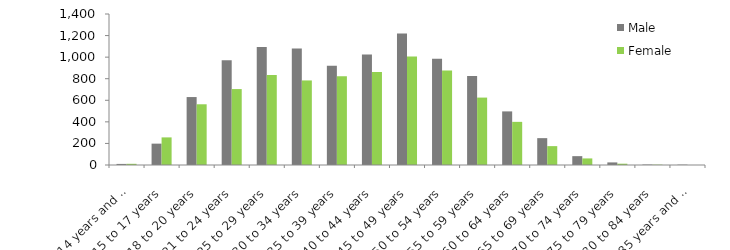
| Category | Male | Female |
|---|---|---|
| 14 years and under | 10 | 11 |
| 15 to 17 years | 198 | 256 |
| 18 to 20 years | 630 | 563 |
| 21 to 24 years | 972 | 704 |
| 25 to 29 years | 1095 | 835 |
| 30 to 34 years | 1081 | 784 |
| 35 to 39 years | 920 | 823 |
| 40 to 44 years | 1024 | 863 |
| 45 to 49 years | 1220 | 1006 |
| 50 to 54 years | 984 | 877 |
| 55 to 59 years | 825 | 625 |
| 60 to 64 years | 497 | 400 |
| 65 to 69 years | 249 | 175 |
| 70 to 74 years | 82 | 61 |
| 75 to 79 years | 24 | 12 |
| 80 to 84 years | 4 | 3 |
| 85 years and over | 3 | 0 |